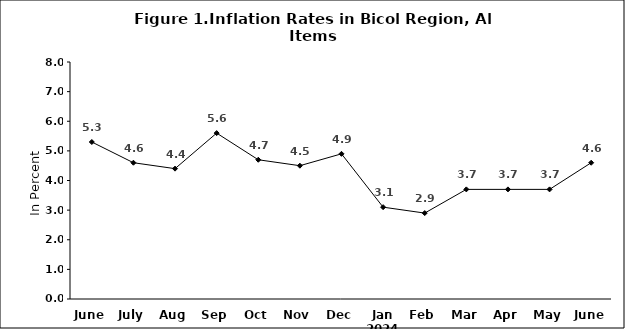
| Category | Series 0 |
|---|---|
| June | 5.3 |
| July | 4.6 |
| Aug | 4.4 |
| Sep | 5.6 |
| Oct | 4.7 |
| Nov | 4.5 |
| Dec | 4.9 |
| Jan 2024 | 3.1 |
| Feb | 2.9 |
| Mar | 3.7 |
| Apr | 3.7 |
| May | 3.7 |
| June | 4.6 |